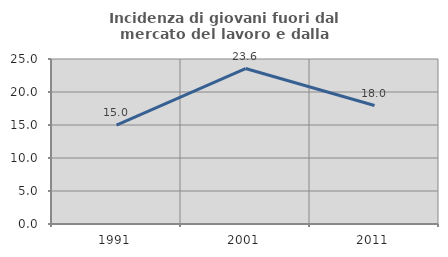
| Category | Incidenza di giovani fuori dal mercato del lavoro e dalla formazione  |
|---|---|
| 1991.0 | 14.971 |
| 2001.0 | 23.559 |
| 2011.0 | 17.954 |